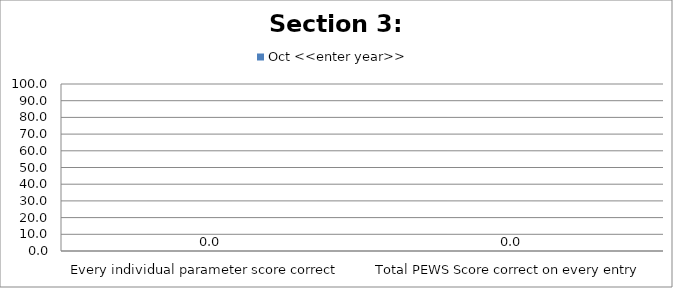
| Category | Oct <<enter year>> |
|---|---|
| Every individual parameter score correct  | 0 |
| Total PEWS Score correct on every entry | 0 |